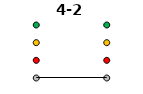
| Category | 0 | 1 | 2 | 3 | 4-2 |
|---|---|---|---|---|---|
| Time 1 | 0 | 1 | 2 | 3 | 0 |
| Time 2 | 0 | 1 | 2 | 3 | 0 |